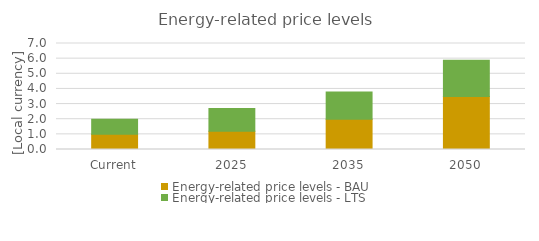
| Category | Energy-related price levels - BAU | Energy-related price levels - LTS |
|---|---|---|
| Current | 1 | 1 |
| 2025 | 1.2 | 1.5 |
| 2035 | 2 | 1.8 |
| 2050 | 3.5 | 2.4 |